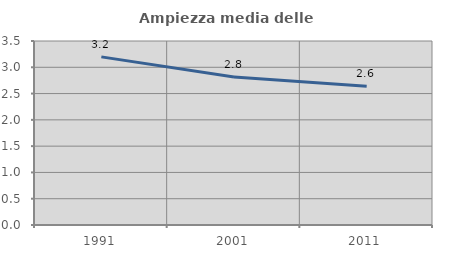
| Category | Ampiezza media delle famiglie |
|---|---|
| 1991.0 | 3.198 |
| 2001.0 | 2.816 |
| 2011.0 | 2.641 |